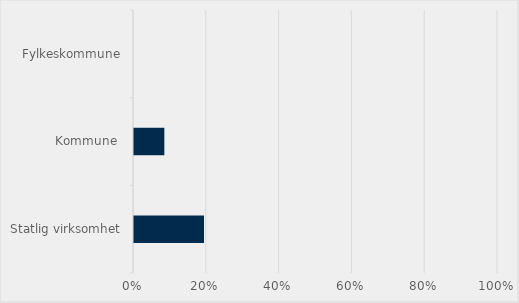
| Category | Prosent |
|---|---|
| Statlig virksomhet | 0.192 |
| Kommune  | 0.083 |
| Fylkeskommune | 0 |